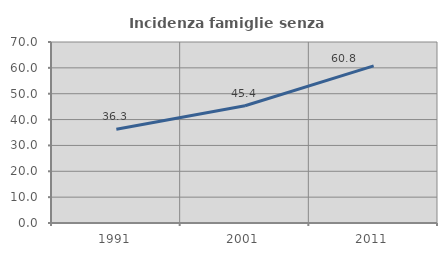
| Category | Incidenza famiglie senza nuclei |
|---|---|
| 1991.0 | 36.254 |
| 2001.0 | 45.359 |
| 2011.0 | 60.755 |